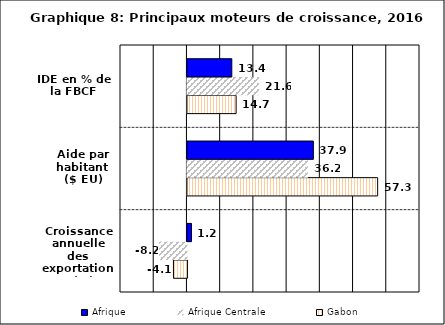
| Category | Gabon | Afrique Centrale | Afrique |
|---|---|---|---|
| Croissance annuelle des exportations (%) | -4.059 | -8.24 | 1.219 |
| Aide par habitant ($ EU) | 57.254 | 36.237 | 37.904 |
| IDE en % de la FBCF | 14.657 | 21.581 | 13.354 |